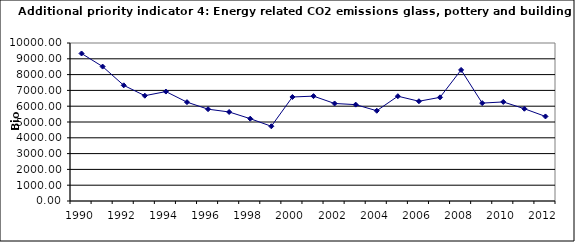
| Category | Energy related CO2 emissions glass, pottery and building materials, kt |
|---|---|
| 1990 | 9337.221 |
| 1991 | 8506.792 |
| 1992 | 7321.926 |
| 1993 | 6664.485 |
| 1994 | 6926.224 |
| 1995 | 6256.082 |
| 1996 | 5811.301 |
| 1997 | 5634.767 |
| 1998 | 5210.203 |
| 1999 | 4729.314 |
| 2000 | 6583.12 |
| 2001 | 6637.617 |
| 2002 | 6172.296 |
| 2003 | 6099.114 |
| 2004 | 5712.21 |
| 2005 | 6632.573 |
| 2006 | 6313.762 |
| 2007 | 6561.004 |
| 2008 | 8295.715 |
| 2009 | 6196.371 |
| 2010 | 6270.548 |
| 2011 | 5838.893 |
| 2012 | 5351.114 |